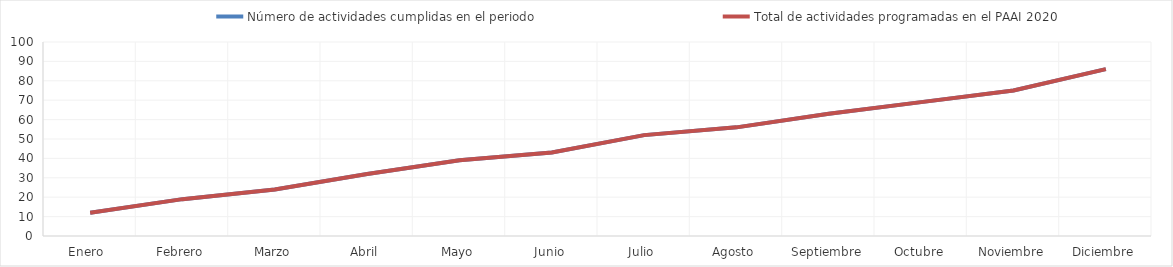
| Category | Número de actividades cumplidas en el periodo | Total de actividades programadas en el PAAI 2020 |
|---|---|---|
| Enero  | 12 | 12 |
| Febrero | 19 | 19 |
| Marzo | 24 | 24 |
| Abril | 32 | 32 |
| Mayo | 39 | 39 |
| Junio | 43 | 43 |
| Julio | 52 | 52 |
| Agosto | 56 | 56 |
| Septiembre | 63 | 63 |
| Octubre | 69 | 69 |
| Noviembre | 75 | 75 |
| Diciembre | 86 | 86 |